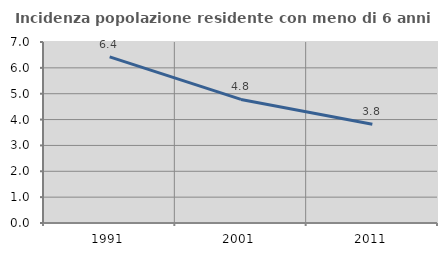
| Category | Incidenza popolazione residente con meno di 6 anni |
|---|---|
| 1991.0 | 6.423 |
| 2001.0 | 4.78 |
| 2011.0 | 3.817 |